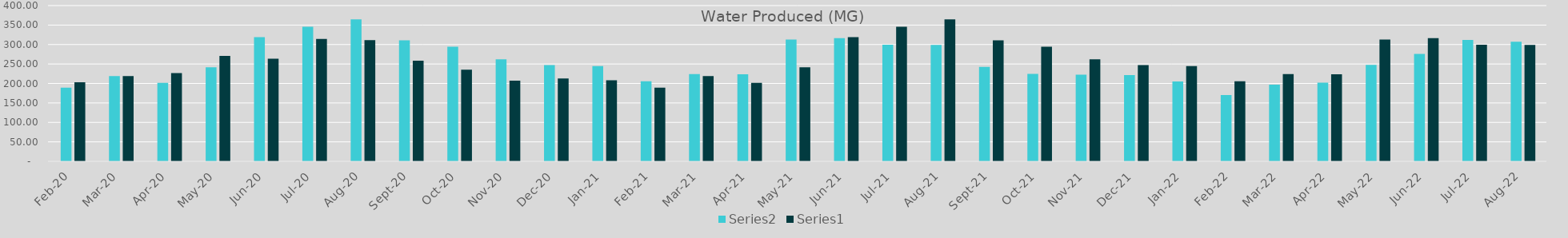
| Category | Series 1 | Series 0 |
|---|---|---|
| 2020-02-01 | 189.14 | 202.92 |
| 2020-03-01 | 218.9 | 218.89 |
| 2020-04-01 | 201.4 | 226.62 |
| 2020-05-01 | 241.3 | 270.85 |
| 2020-06-01 | 318.9 | 263.67 |
| 2020-07-01 | 345.4 | 314.55 |
| 2020-08-01 | 364.8 | 311.17 |
| 2020-09-01 | 311 | 258.3 |
| 2020-10-01 | 294.3 | 235.52 |
| 2020-11-01 | 262.21 | 207.02 |
| 2020-12-01 | 246.95 | 212.652 |
| 2021-01-01 | 244.698 | 208.082 |
| 2021-02-01 | 205.51 | 189.14 |
| 2021-03-01 | 223.92 | 218.9 |
| 2021-04-01 | 223.48 | 201.4 |
| 2021-05-01 | 312.74 | 241.3 |
| 2021-06-01 | 316.23 | 318.9 |
| 2021-07-01 | 299.67 | 345.4 |
| 2021-08-01 | 299.01 | 364.8 |
| 2021-09-01 | 242.761 | 311 |
| 2021-10-01 | 224.43 | 294.3 |
| 2021-11-01 | 222.799 | 262.21 |
| 2021-12-01 | 221.476 | 246.95 |
| 2022-01-01 | 204.928 | 244.698 |
| 2022-02-01 | 170.15 | 205.51 |
| 2022-03-01 | 196.94 | 223.92 |
| 2022-04-01 | 201.87 | 223.48 |
| 2022-05-01 | 247.56 | 312.74 |
| 2022-06-01 | 275.83 | 316.23 |
| 2022-07-01 | 311.59 | 299.67 |
| 2022-08-01 | 306.95 | 299.01 |